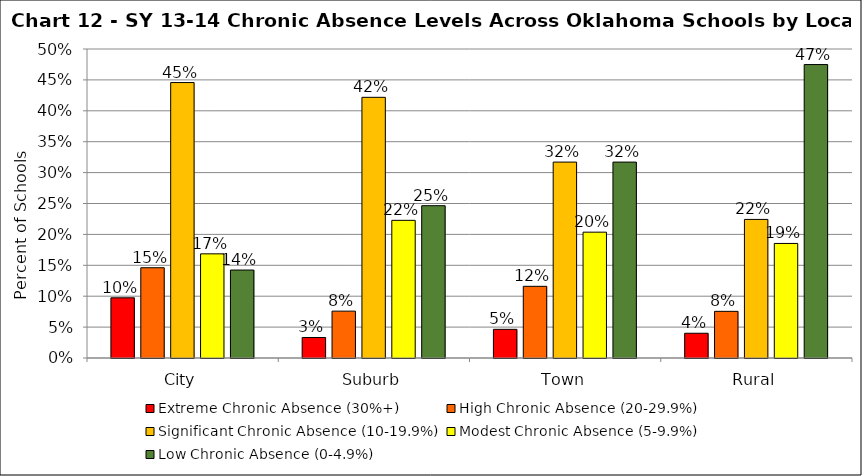
| Category | Extreme Chronic Absence (30%+) | High Chronic Absence (20-29.9%) | Significant Chronic Absence (10-19.9%) | Modest Chronic Absence (5-9.9%) | Low Chronic Absence (0-4.9%) |
|---|---|---|---|---|---|
| 0 | 0.097 | 0.146 | 0.446 | 0.169 | 0.142 |
| 1 | 0.033 | 0.076 | 0.422 | 0.223 | 0.246 |
| 2 | 0.046 | 0.116 | 0.317 | 0.204 | 0.317 |
| 3 | 0.04 | 0.076 | 0.224 | 0.185 | 0.475 |